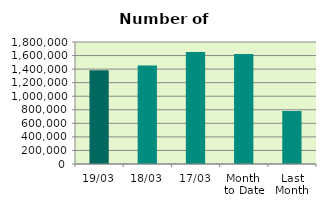
| Category | Series 0 |
|---|---|
| 19/03 | 1382338 |
| 18/03 | 1452778 |
| 17/03 | 1652626 |
| Month 
to Date | 1624757.857 |
| Last
Month | 783511.9 |